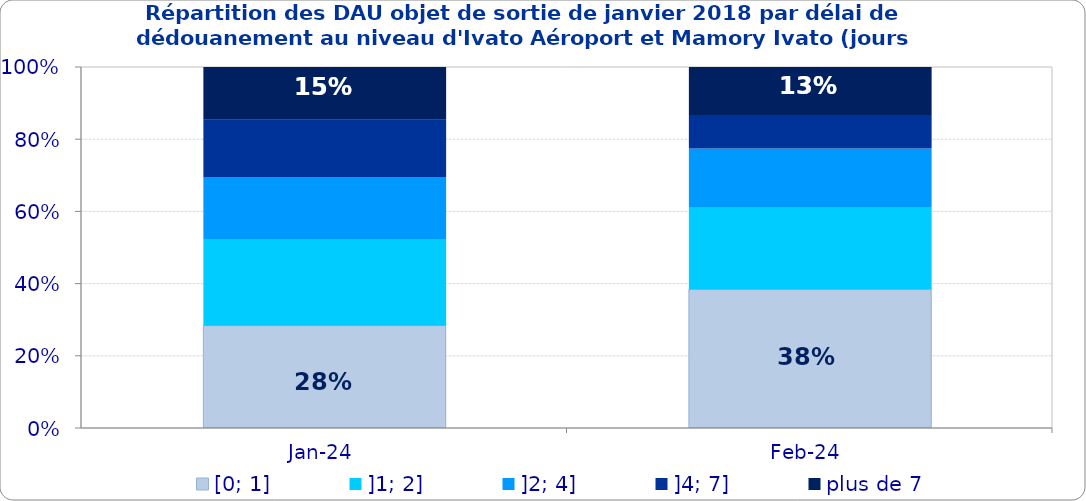
| Category | [0; 1] | ]1; 2] | ]2; 4] | ]4; 7] | plus de 7 |
|---|---|---|---|---|---|
| 2024-01-01 | 0.284 | 0.24 | 0.172 | 0.159 | 0.146 |
| 2024-02-01 | 0.384 | 0.229 | 0.162 | 0.093 | 0.133 |